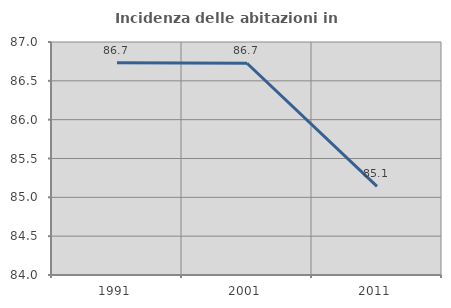
| Category | Incidenza delle abitazioni in proprietà  |
|---|---|
| 1991.0 | 86.732 |
| 2001.0 | 86.727 |
| 2011.0 | 85.14 |